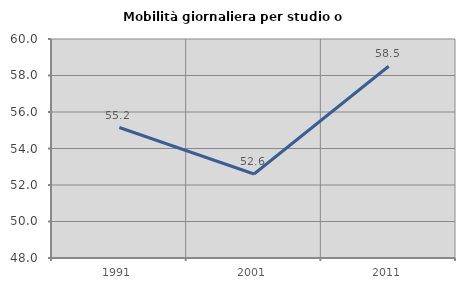
| Category | Mobilità giornaliera per studio o lavoro |
|---|---|
| 1991.0 | 55.15 |
| 2001.0 | 52.602 |
| 2011.0 | 58.509 |